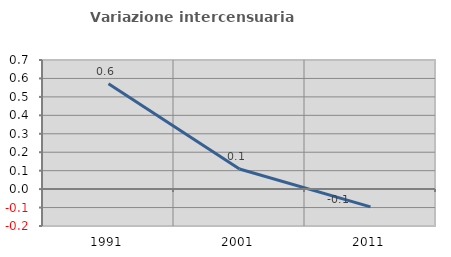
| Category | Variazione intercensuaria annua |
|---|---|
| 1991.0 | 0.572 |
| 2001.0 | 0.109 |
| 2011.0 | -0.096 |